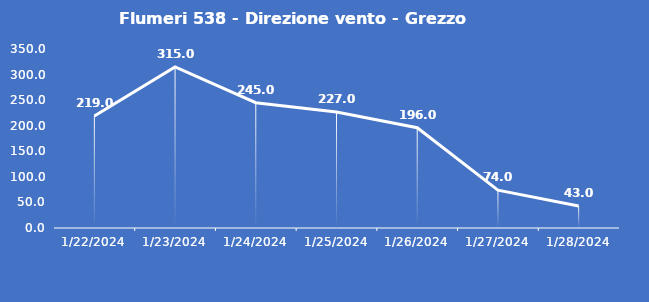
| Category | Flumeri 538 - Direzione vento - Grezzo (°N) |
|---|---|
| 1/22/24 | 219 |
| 1/23/24 | 315 |
| 1/24/24 | 245 |
| 1/25/24 | 227 |
| 1/26/24 | 196 |
| 1/27/24 | 74 |
| 1/28/24 | 43 |